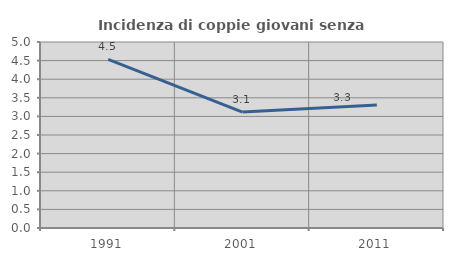
| Category | Incidenza di coppie giovani senza figli |
|---|---|
| 1991.0 | 4.532 |
| 2001.0 | 3.117 |
| 2011.0 | 3.307 |